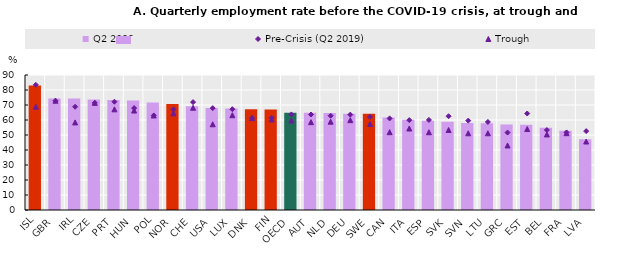
| Category | Q2 2022 |
|---|---|
| ISL | 83.027 |
| GBR | 74.311 |
| IRL | 74.293 |
| CZE | 73.707 |
| PRT | 73.361 |
| HUN | 72.925 |
| POL | 71.727 |
| NOR | 70.62 |
| CHE | 69.109 |
| USA | 67.951 |
| LUX | 67.615 |
| DNK | 67.193 |
| FIN | 66.98 |
| OECD | 64.833 |
| AUT | 64.804 |
| NLD | 64.628 |
| DEU | 64.202 |
| SWE | 64.096 |
| CAN | 61.607 |
| ITA | 60.206 |
| ESP | 59.463 |
| SVK | 58.901 |
| SVN | 57.967 |
| LTU | 57.89 |
| GRC | 57.023 |
| EST | 56.889 |
| BEL | 54.852 |
| FRA | 52.85 |
| LVA | 47.132 |